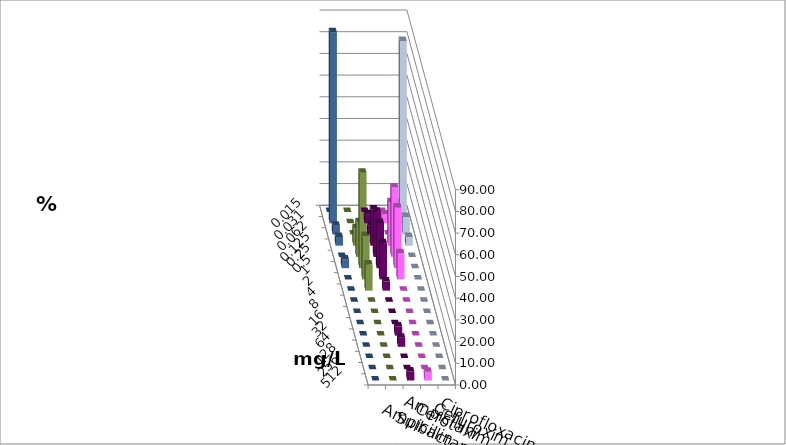
| Category | Ampicillin | Ampicillin/ Sulbactam | Cefotaxim | Cefuroxim | Ciprofloxacin |
|---|---|---|---|---|---|
| 0.015 | 0 | 0 | 4 | 0 | 0 |
| 0.031 | 4.167 | 4 | 84 | 0 | 88 |
| 0.062 | 4.167 | 0 | 8 | 0 | 4 |
| 0.125 | 16.667 | 20 | 4 | 8 | 4 |
| 0.25 | 20.833 | 32 | 0 | 16 | 0 |
| 0.5 | 20.833 | 28 | 0 | 44 | 4 |
| 1.0 | 16.667 | 12 | 0 | 20 | 0 |
| 2.0 | 4.167 | 0 | 0 | 12 | 0 |
| 4.0 | 0 | 0 | 0 | 0 | 0 |
| 8.0 | 0 | 0 | 0 | 0 | 0 |
| 16.0 | 0 | 0 | 0 | 0 | 0 |
| 32.0 | 4.167 | 0 | 0 | 0 | 0 |
| 64.0 | 4.167 | 0 | 0 | 0 | 0 |
| 128.0 | 0 | 0 | 0 | 0 | 0 |
| 256.0 | 0 | 0 | 0 | 0 | 0 |
| 512.0 | 4.167 | 4 | 0 | 0 | 0 |